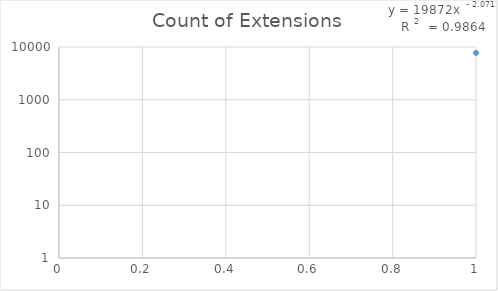
| Category | Count of Extensions |
|---|---|
| 0 | 7716 |
| 1 | 5527 |
| 2 | 3065 |
| 3 | 2781 |
| 4 | 908 |
| 5 | 302 |
| 6 | 282 |
| 7 | 253 |
| 8 | 172 |
| 9 | 142 |
| 10 | 118 |
| 11 | 104 |
| 12 | 101 |
| 13 | 91 |
| 14 | 62 |
| 15 | 62 |
| 16 | 61 |
| 17 | 54 |
| 18 | 52 |
| 19 | 43 |
| 20 | 42 |
| 21 | 40 |
| 22 | 37 |
| 23 | 36 |
| 24 | 36 |
| 25 | 29 |
| 26 | 23 |
| 27 | 23 |
| 28 | 22 |
| 29 | 19 |
| 30 | 18 |
| 31 | 15 |
| 32 | 15 |
| 33 | 15 |
| 34 | 15 |
| 35 | 14 |
| 36 | 13 |
| 37 | 13 |
| 38 | 12 |
| 39 | 11 |
| 40 | 11 |
| 41 | 11 |
| 42 | 9 |
| 43 | 8 |
| 44 | 8 |
| 45 | 7 |
| 46 | 7 |
| 47 | 7 |
| 48 | 6 |
| 49 | 6 |
| 50 | 6 |
| 51 | 6 |
| 52 | 6 |
| 53 | 6 |
| 54 | 5 |
| 55 | 4 |
| 56 | 4 |
| 57 | 4 |
| 58 | 4 |
| 59 | 3 |
| 60 | 3 |
| 61 | 3 |
| 62 | 3 |
| 63 | 3 |
| 64 | 3 |
| 65 | 3 |
| 66 | 3 |
| 67 | 3 |
| 68 | 3 |
| 69 | 3 |
| 70 | 3 |
| 71 | 3 |
| 72 | 3 |
| 73 | 2 |
| 74 | 2 |
| 75 | 2 |
| 76 | 2 |
| 77 | 2 |
| 78 | 2 |
| 79 | 2 |
| 80 | 2 |
| 81 | 2 |
| 82 | 2 |
| 83 | 2 |
| 84 | 2 |
| 85 | 2 |
| 86 | 2 |
| 87 | 2 |
| 88 | 2 |
| 89 | 2 |
| 90 | 2 |
| 91 | 2 |
| 92 | 2 |
| 93 | 1 |
| 94 | 1 |
| 95 | 1 |
| 96 | 1 |
| 97 | 1 |
| 98 | 1 |
| 99 | 1 |
| 100 | 1 |
| 101 | 1 |
| 102 | 1 |
| 103 | 1 |
| 104 | 1 |
| 105 | 1 |
| 106 | 1 |
| 107 | 1 |
| 108 | 1 |
| 109 | 1 |
| 110 | 1 |
| 111 | 1 |
| 112 | 1 |
| 113 | 1 |
| 114 | 1 |
| 115 | 1 |
| 116 | 1 |
| 117 | 1 |
| 118 | 1 |
| 119 | 1 |
| 120 | 1 |
| 121 | 1 |
| 122 | 1 |
| 123 | 1 |
| 124 | 1 |
| 125 | 1 |
| 126 | 1 |
| 127 | 1 |
| 128 | 1 |
| 129 | 1 |
| 130 | 1 |
| 131 | 1 |
| 132 | 1 |
| 133 | 1 |
| 134 | 1 |
| 135 | 1 |
| 136 | 1 |
| 137 | 1 |
| 138 | 1 |
| 139 | 1 |
| 140 | 1 |
| 141 | 1 |
| 142 | 1 |
| 143 | 1 |